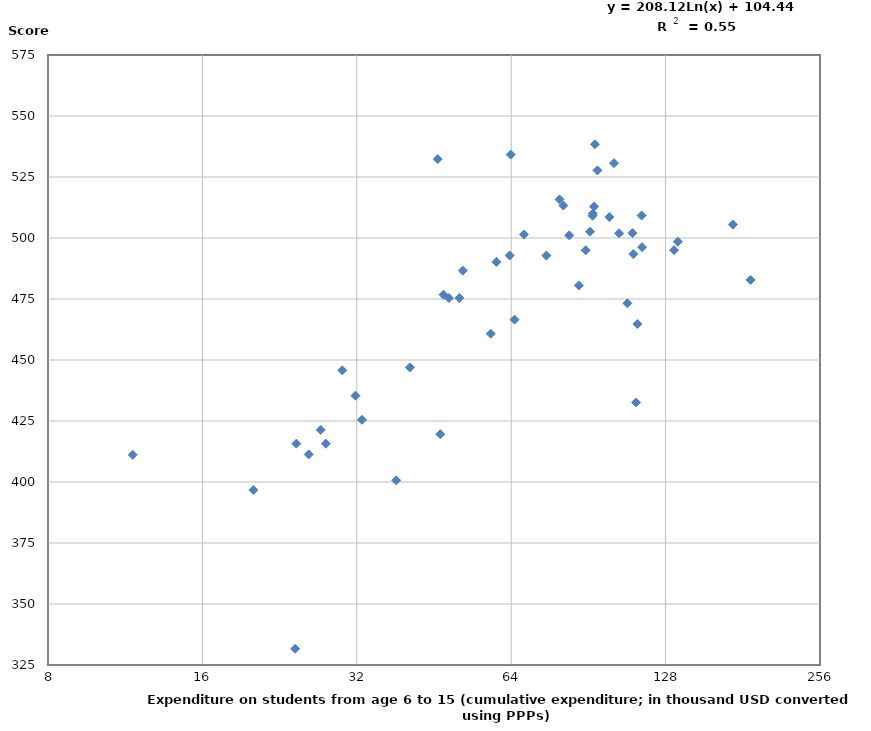
| Category | Spending on education |
|---|---|
| nan | 427.225 |
| nan | 375.745 |
| 92.31615 | 509.994 |
| 132.95489999999998 | 495.038 |
| 110.31569999999999 | 502 |
| 38.19045 | 400.682 |
| nan | 517.779 |
| 29.980040000000002 | 445.772 |
| nan | 475.187 |
| 94.25362 | 527.705 |
| 40.6075 | 446.956 |
| 46.00873 | 532.348 |
| 24.395349999999997 | 415.729 |
| 46.531400000000005 | 419.608 |
| 50.72243 | 475.391 |
| 112.1334 | 432.596 |
| 63.57586 | 492.83 |
| 103.8517 | 501.937 |
| 24.264080000000003 | 331.639 |
| 63.8576 | 534.194 |
| 101.5273 | 530.661 |
| 89.435 | 494.978 |
| nan | 383.682 |
| 11.703520000000001 | 411.132 |
| 92.2139 | 509.141 |
| nan | 454.829 |
| nan | 523.277 |
| 47.228989999999996 | 476.748 |
| 107.8115 | 473.23 |
| nan | 403.1 |
| 91.17135 | 502.575 |
| 64.97263 | 466.553 |
| 86.70079 | 480.547 |
| 93.19991 | 538.395 |
| nan | 408.669 |
| 79.51680999999999 | 515.81 |
| nan | 378.442 |
| 59.89878 | 490.225 |
| nan | 386.485 |
| 48.389 | 475.409 |
| 187.4588 | 482.806 |
| nan | 528.55 |
| 112.7804 | 464.782 |
| 27.84844 | 415.71 |
| nan | 427.998 |
| 25.786459999999998 | 411.314 |
| 99.43008 | 508.575 |
| 80.88951 | 513.304 |
| 135.22729999999999 | 498.481 |
| 20.11357 | 396.684 |
| 67.76701 | 501.435 |
| 83.05008000000001 | 501.1 |
| nan | 417.611 |
| nan | 434.885 |
| 51.491510000000005 | 486.631 |
| nan | 555.575 |
| 58.3816 | 460.775 |
| 92.85016 | 512.864 |
| 74.94694 | 492.786 |
| 110.7326 | 493.422 |
| 173.1513 | 505.506 |
| 27.21962 | 421.337 |
| nan | 424.59 |
| nan | 386.403 |
| 32.751619999999996 | 425.49 |
| nan | 436.731 |
| 114.9201 | 509.222 |
| 115.1797 | 496.242 |
| 31.811040000000002 | 435.363 |
| nan | 524.644 |